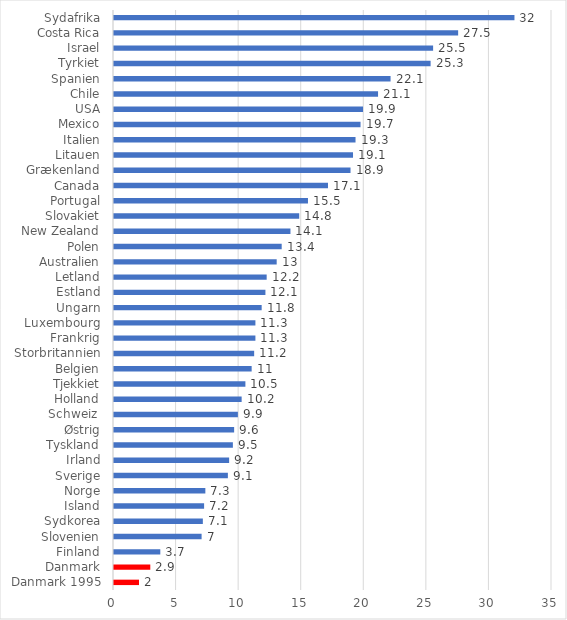
| Category | Series 0 |
|---|---|
| Danmark 1995 | 2 |
| Danmark | 2.9 |
| Finland | 3.7 |
| Slovenien | 7 |
| Sydkorea | 7.1 |
| Island | 7.2 |
| Norge | 7.3 |
| Sverige | 9.1 |
| Irland | 9.2 |
| Tyskland | 9.5 |
| Østrig | 9.6 |
| Schweiz  | 9.9 |
| Holland | 10.2 |
| Tjekkiet | 10.5 |
| Belgien | 11 |
| Storbritannien | 11.2 |
| Frankrig | 11.3 |
| Luxembourg | 11.3 |
| Ungarn | 11.8 |
| Estland | 12.1 |
| Letland | 12.2 |
| Australien | 13 |
| Polen | 13.4 |
| New Zealand | 14.1 |
| Slovakiet | 14.8 |
| Portugal | 15.5 |
| Canada | 17.1 |
| Grækenland | 18.9 |
| Litauen | 19.1 |
| Italien | 19.3 |
| Mexico | 19.7 |
| USA | 19.9 |
| Chile | 21.1 |
| Spanien | 22.1 |
| Tyrkiet | 25.3 |
| Israel | 25.5 |
| Costa Rica | 27.5 |
| Sydafrika | 32 |